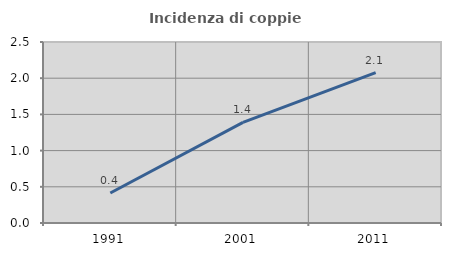
| Category | Incidenza di coppie miste |
|---|---|
| 1991.0 | 0.415 |
| 2001.0 | 1.391 |
| 2011.0 | 2.078 |